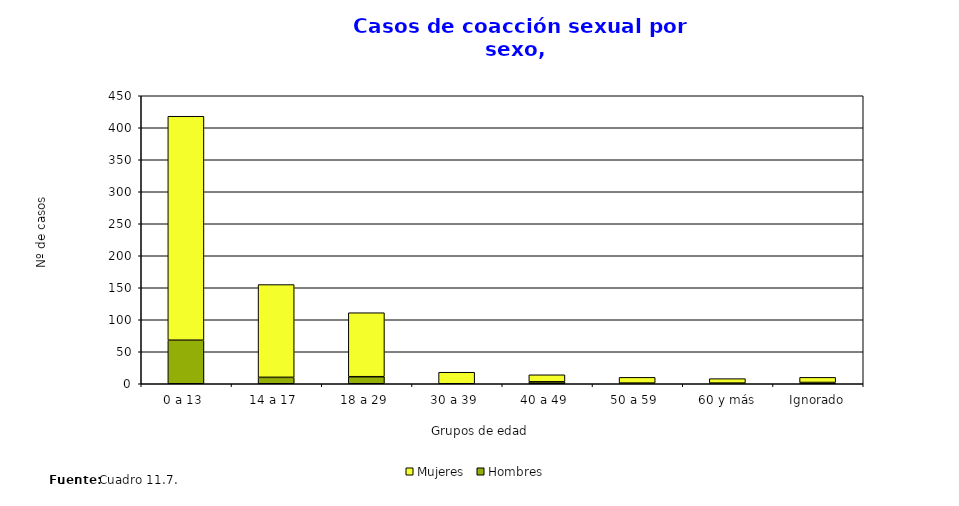
| Category | Hombres | Mujeres |
|---|---|---|
| 0 a 13  | 68 | 350 |
| 14 a 17  | 10 | 145 |
| 18 a 29  | 11 | 100 |
| 30 a 39  | 0 | 18 |
| 40 a 49  | 3 | 11 |
| 50 a 59  | 1 | 9 |
| 60 y más | 1 | 7 |
| Ignorado | 2 | 8 |